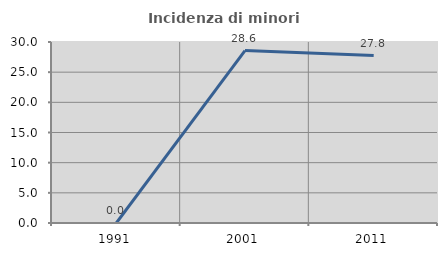
| Category | Incidenza di minori stranieri |
|---|---|
| 1991.0 | 0 |
| 2001.0 | 28.571 |
| 2011.0 | 27.758 |